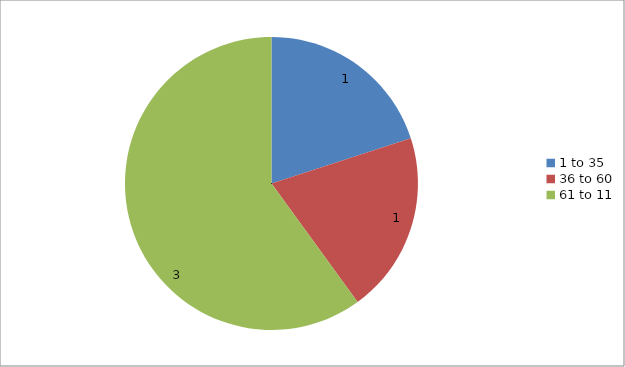
| Category | Series 0 |
|---|---|
| 1 to 35 | 1 |
| 36 to 60 | 1 |
| 61 to 11 | 3 |